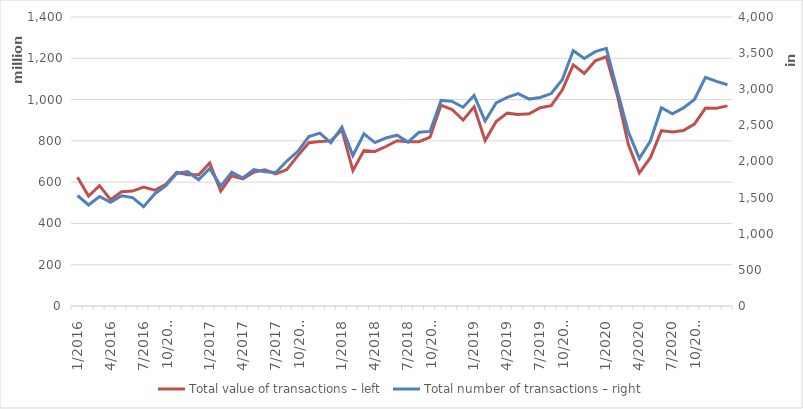
| Category | Total |
|---|---|
| 1/2016 | 623719958 |
| 2/2016 | 532385709 |
| 3/2016 | 582836319 |
| 4/2016 | 515291890 |
| 5/2016 | 553441839 |
| 6/2016 | 556836864 |
| 7/2016 | 575613675 |
| 8/2016 | 560806298 |
| 9/2016 | 588038057 |
| 10/2016 | 647245989 |
| 11/2016 | 635952032 |
| 12/2016 | 635268256 |
| 1/2017 | 692948345 |
| 2/2017 | 556418837 |
| 3/2017 | 631091280 |
| 4/2017 | 615993630 |
| 5/2017 | 648629380 |
| 6/2017 | 659859183 |
| 7/2017 | 640128686 |
| 8/2017 | 660847615 |
| 9/2017 | 728459665 |
| 10/2017 | 790689068 |
| 11/2017 | 797055016 |
| 12/2017 | 799872308 |
| 1/2018 | 853592153 |
| 2/2018 | 655926827 |
| 3/2018 | 752870032 |
| 4/2018 | 748849650 |
| 5/2018 | 772607012 |
| 6/2018 | 800347667 |
| 7/2018 | 796226717 |
| 8/2018 | 795722806 |
| 9/2018 | 817671052 |
| 10/2018 | 973090121 |
| 11/2018 | 951940506 |
| 12/2018 | 900339566 |
| 1/2019 | 964859478.141 |
| 2/2019 | 801230409.391 |
| 3/2019 | 893619939.186 |
| 4/2019 | 934260221.069 |
| 5/2019 | 928013285.13 |
| 6/2019 | 931594027.121 |
| 7/2019 | 960824947.818 |
| 8/2019 | 970372664.504 |
| 9/2019 | 1046414153.182 |
| 10/2019 | 1167784591.403 |
| 11/2019 | 1126379975.393 |
| 12/2019 | 1188209702.989 |
| 1/2020 | 1207442251.338 |
| 2/2020 | 1020966852.211 |
| 3/2020 | 781909445.435 |
| 4/2020 | 644672811.643 |
| 5/2020 | 718170313.006 |
| 6/2020 | 849262284.621 |
| 7/2020 | 843240800.575 |
| 8/2020 | 849735212.73 |
| 9/2020 | 881347165.504 |
| 10/2020 | 958710552.608 |
| 11/2020 | 957642177.602 |
| 12/2020 | 969383038.753 |